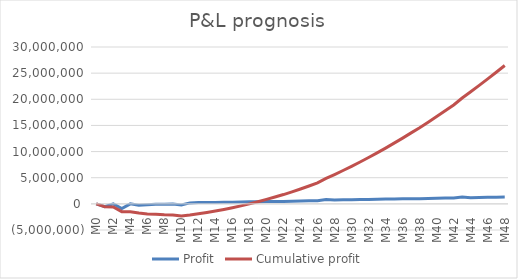
| Category | Profit | Cumulative profit |
|---|---|---|
| M0 | -3466.205 | -3466.205 |
| M1 | -558058.925 | -561525.13 |
| M2 | -17331.023 | -578856.153 |
| M3 | -914211.438 | -1493067.591 |
| M4 | -0.002 | -1493067.593 |
| M5 | -252166.378 | -1745233.971 |
| M6 | -178856.153 | -1924090.123 |
| M7 | -77360.739 | -2001450.863 |
| M8 | -77360.739 | -2078811.602 |
| M9 | -37922.265 | -2116733.867 |
| M10 | -196504.587 | -2313238.453 |
| M11 | 185914.419 | -2127324.034 |
| M12 | 236016.581 | -1891307.453 |
| M13 | 248919.984 | -1642387.469 |
| M14 | 275366.243 | -1367021.226 |
| M15 | 301784.683 | -1065236.543 |
| M16 | 328172.995 | -737063.547 |
| M17 | 355695.282 | -381368.266 |
| M18 | 383242.394 | 1874.128 |
| M19 | 410818.623 | 412692.751 |
| M20 | 438423.188 | 851115.938 |
| M21 | 466059.203 | 1317175.142 |
| M22 | 459851.51 | 1777026.652 |
| M23 | 519270.966 | 2296297.618 |
| M24 | 547009.097 | 2843306.715 |
| M25 | 572258.231 | 3415564.945 |
| M26 | 600075.601 | 4015640.547 |
| M27 | 851637.533 | 4867278.079 |
| M28 | 742487.014 | 5609765.093 |
| M29 | 770996.131 | 6380761.224 |
| M30 | 799581.356 | 7180342.58 |
| M31 | 828246.429 | 8008589.009 |
| M32 | 856996.963 | 8865585.973 |
| M33 | 886753.088 | 9752339.061 |
| M34 | 913925.099 | 10666264.159 |
| M35 | 941135.597 | 11607399.757 |
| M36 | 968387.613 | 12575787.37 |
| M37 | 995683.523 | 13571470.893 |
| M38 | 989150.297 | 14560621.189 |
| M39 | 1048202.908 | 15608824.097 |
| M40 | 1075525.278 | 16684349.375 |
| M41 | 1102836.72 | 17787186.095 |
| M42 | 1130130.58 | 18917316.675 |
| M43 | 1332956.301 | 20250272.976 |
| M44 | 1187623.78 | 21437896.756 |
| M45 | 1214857.934 | 22652754.69 |
| M46 | 1242060.51 | 23894815.2 |
| M47 | 1269235.019 | 25164050.219 |
| M48 | 1296373.846 | 26460424.066 |